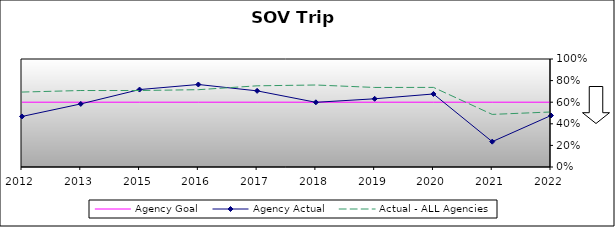
| Category | Agency Goal | Agency Actual | Actual - ALL Agencies |
|---|---|---|---|
| 2012.0 | 0.6 | 0.468 | 0.694 |
| 2013.0 | 0.6 | 0.584 | 0.708 |
| 2015.0 | 0.6 | 0.717 | 0.708 |
| 2016.0 | 0.6 | 0.764 | 0.716 |
| 2017.0 | 0.6 | 0.705 | 0.752 |
| 2018.0 | 0.6 | 0.599 | 0.759 |
| 2019.0 | 0.6 | 0.632 | 0.736 |
| 2020.0 | 0.6 | 0.676 | 0.737 |
| 2021.0 | 0.6 | 0.235 | 0.487 |
| 2022.0 | 0.6 | 0.477 | 0.509 |